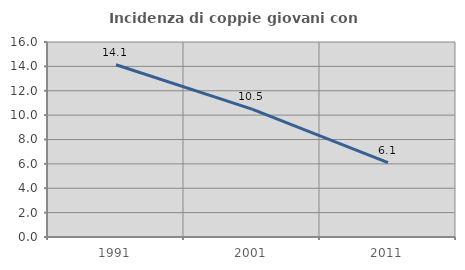
| Category | Incidenza di coppie giovani con figli |
|---|---|
| 1991.0 | 14.134 |
| 2001.0 | 10.491 |
| 2011.0 | 6.11 |